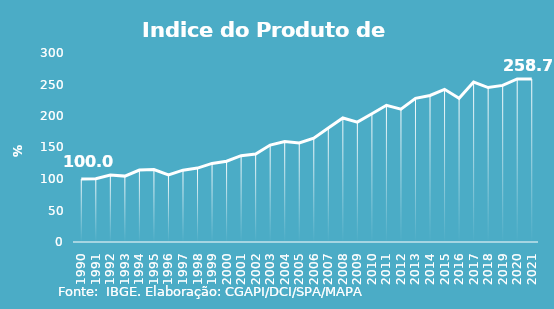
| Category | Indice de Prod. base 1990 |
|---|---|
| 1990.0 | 100 |
| 1991.0 | 100.275 |
| 1992.0 | 106.203 |
| 1993.0 | 104.57 |
| 1994.0 | 114.164 |
| 1995.0 | 115.024 |
| 1996.0 | 106.552 |
| 1997.0 | 114.037 |
| 1998.0 | 117.319 |
| 1999.0 | 124.734 |
| 2000.0 | 128.293 |
| 2001.0 | 136.975 |
| 2002.0 | 139.51 |
| 2003.0 | 153.868 |
| 2004.0 | 159.641 |
| 2005.0 | 157.136 |
| 2006.0 | 164.858 |
| 2007.0 | 180.781 |
| 2008.0 | 196.91 |
| 2009.0 | 190.309 |
| 2010.0 | 203.581 |
| 2011.0 | 217.041 |
| 2012.0 | 210.932 |
| 2013.0 | 228.009 |
| 2014.0 | 232.562 |
| 2015.0 | 242.318 |
| 2016.0 | 228.239 |
| 2017.0 | 253.826 |
| 2018.0 | 245.134 |
| 2019.0 | 248.619 |
| 2020.0 | 258.848 |
| 2021.0 | 258.731 |